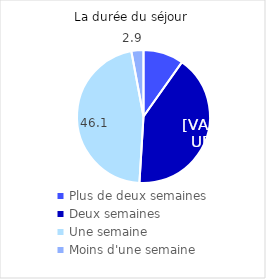
| Category | Series 0 |
|---|---|
| Plus de deux semaines | 9.804 |
| Deux semaines | 41.176 |
| Une semaine | 46.078 |
| Moins d'une semaine | 2.941 |